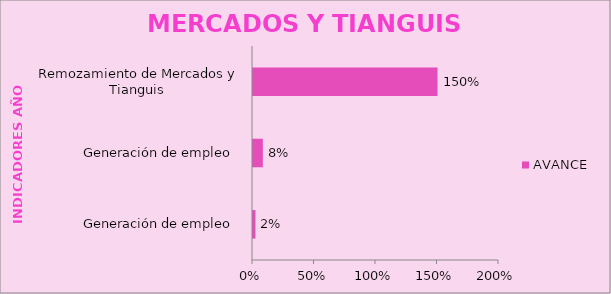
| Category | AVANCE  |
|---|---|
| Generación de empleo  | 0.02 |
| Generación de empleo  | 0.08 |
| Remozamiento de Mercados y Tianguis  | 1.5 |